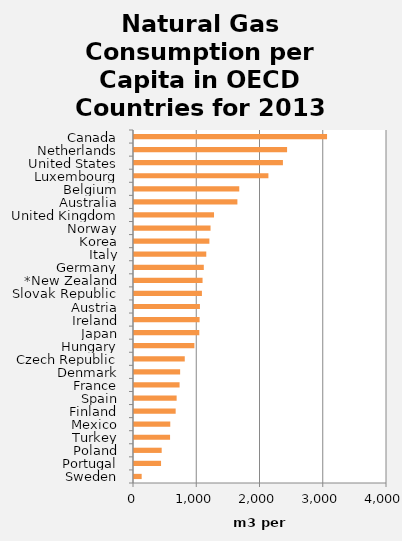
| Category | Natural Gas Consumption per Capita in OECD Countries for 2013 |
|---|---|
| Sweden | 121.222 |
| Portugal | 427.675 |
| Poland | 437.772 |
| Turkey | 570.12 |
| Mexico | 573.305 |
| Finland | 658.73 |
| Spain | 674.051 |
| France | 720.589 |
| Denmark | 729.394 |
| Czech Republic | 802.56 |
| Hungary | 954.755 |
| Japan | 1032.616 |
| Ireland | 1037.224 |
| Austria | 1042.39 |
| Slovak Republic | 1073.894 |
| *New Zealand | 1083.858 |
| Germany | 1103.622 |
| Italy | 1142.661 |
| Korea | 1191.906 |
| Norway | 1210.176 |
| United Kingdom | 1265.222 |
| Australia | 1634.666 |
| Belgium | 1664.257 |
| Luxembourg | 2124.943 |
| United States | 2354.58 |
| Netherlands | 2420.275 |
| Canada | 3052.12 |